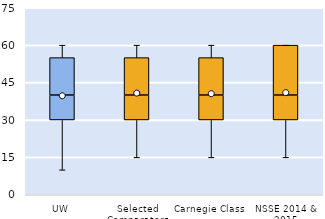
| Category | 25th | 50th | 75th |
|---|---|---|---|
| UW | 30 | 10 | 15 |
| Selected Comparators | 30 | 10 | 15 |
| Carnegie Class | 30 | 10 | 15 |
| NSSE 2014 & 2015 | 30 | 10 | 20 |